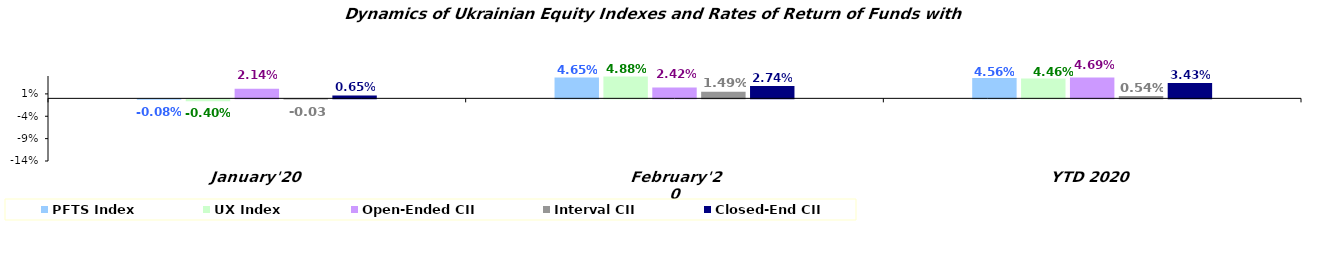
| Category | PFTS Index | UX Index | Open-Ended CII | Interval CII | Closed-End CII |
|---|---|---|---|---|---|
| January'20 | -0.001 | -0.004 | 0.021 | 0 | 0.006 |
| February'20 | 0.046 | 0.049 | 0.024 | 0.015 | 0.027 |
| YTD 2020 | 0.046 | 0.045 | 0.047 | 0.005 | 0.034 |